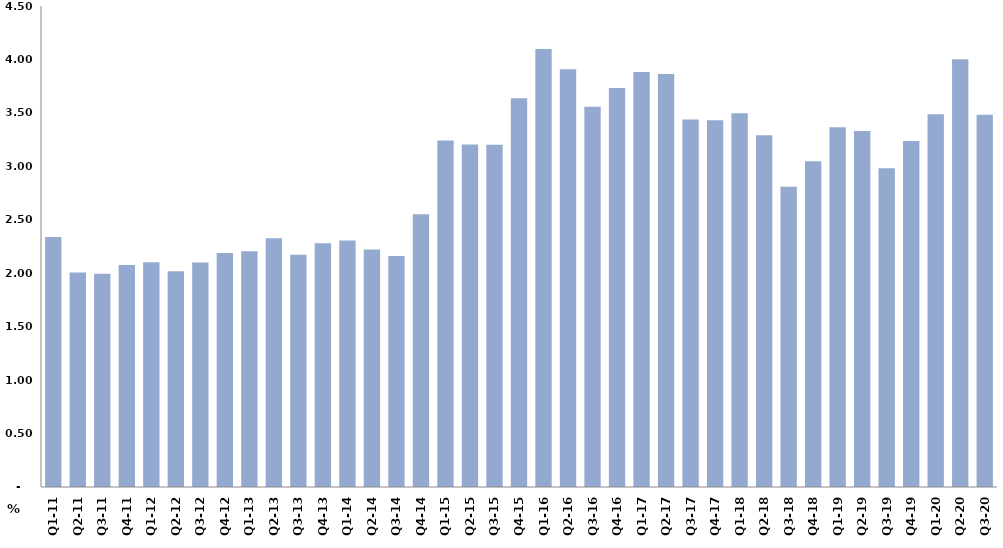
| Category | النسبة المئوية من الناتج المحلي الاجمالي 
Percent of Total GDP |
|---|---|
| Q1-11 | 2.339 |
| Q2-11 | 2.008 |
| Q3-11 | 1.994 |
| Q4-11 | 2.076 |
| Q1-12 | 2.102 |
| Q2-12 | 2.018 |
| Q3-12 | 2.101 |
| Q4-12 | 2.189 |
| Q1-13 | 2.207 |
| Q2-13 | 2.327 |
| Q3-13 | 2.173 |
| Q4-13 | 2.281 |
| Q1-14 | 2.305 |
| Q2-14 | 2.222 |
| Q3-14 | 2.161 |
| Q4-14 | 2.552 |
| Q1-15 | 3.243 |
| Q2-15 | 3.205 |
| Q3-15 | 3.201 |
| Q4-15 | 3.636 |
| Q1-16 | 4.097 |
| Q2-16 | 3.909 |
| Q3-16 | 3.557 |
| Q4-16 | 3.732 |
| Q1-17 | 3.883 |
| Q2-17 | 3.863 |
| Q3-17 | 3.437 |
| Q4-17 | 3.431 |
| Q1-18 | 3.496 |
| Q2-18 | 3.29 |
| Q3-18 | 2.809 |
| Q4-18 | 3.047 |
| Q1-19 | 3.365 |
| Q2-19 | 3.332 |
| Q3-19 | 2.981 |
| Q4-19 | 3.236 |
| Q1-20 | 3.486 |
| Q2-20 | 4.003 |
| Q3-20 | 3.482 |